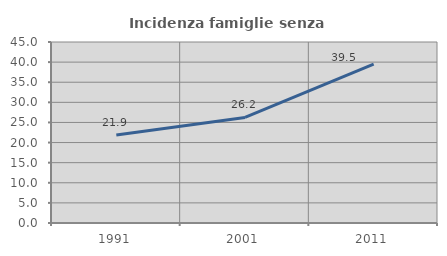
| Category | Incidenza famiglie senza nuclei |
|---|---|
| 1991.0 | 21.888 |
| 2001.0 | 26.236 |
| 2011.0 | 39.483 |